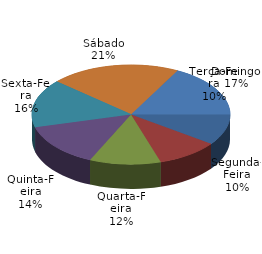
| Category | Qtde Vítimas |
|---|---|
| Segunda-Feira | 174 |
| Terça-Feira | 176 |
| Quarta-Feira | 201 |
| Quinta-Feira | 245 |
| Sexta-Feira | 271 |
| Sábado | 369 |
| Domingo | 299 |